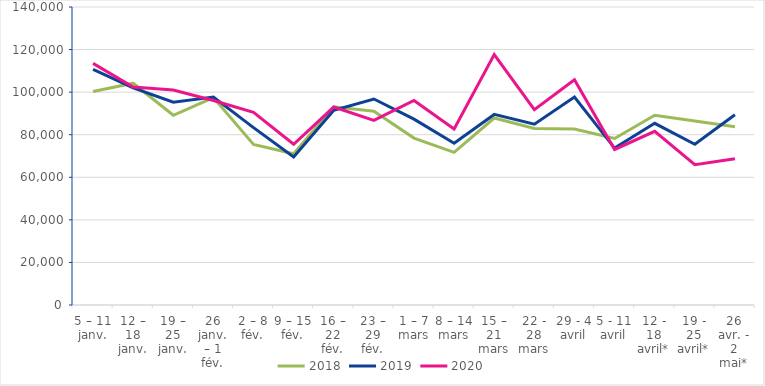
| Category | 2018 | 2019 | 2020 |
|---|---|---|---|
| 5 – 11 janv. | 100330 | 110701 | 113506 |
| 12 – 18 janv. | 104190 | 102045 | 102407 |
| 19 – 25 janv. | 89142 | 95260 | 100966 |
| 26 janv. – 1 fév. | 97441 | 97699 | 96042 |
| 2 – 8 fév. | 75434 | 83347 | 90495 |
| 9 – 15 fév. | 71031 | 69559 | 75523 |
| 16 – 22 fév. | 93102 | 91428 | 93003 |
| 23 – 29 fév. | 91065 | 96774 | 86699 |
| 1 – 7 mars | 78415 | 87314 | 96119 |
| 8 – 14 mars | 71697 | 76021 | 82690 |
| 15 – 21 mars | 87845 | 89536 | 117673 |
| 22 - 28 mars | 82895 | 84912 | 91764 |
| 29 - 4 avril | 82654 | 97699 | 105802 |
| 5 - 11 avril | 78244 | 73699 | 73061 |
| 12 - 18 avril* | 89129 | 85348 | 81593 |
| 19 - 25 avril* | 86398 | 75509 | 65900 |
| 26 avr. - 2 mai* | 83743 | 89413 | 68682.902 |